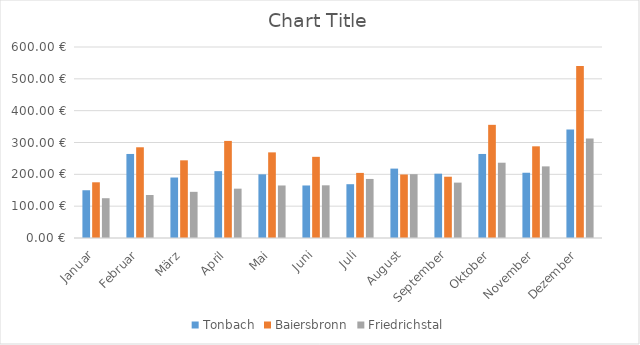
| Category | Tonbach | Baiersbronn | Friedrichstal |
|---|---|---|---|
| Januar | 150 | 175 | 125 |
| Februar | 264 | 285 | 135 |
| März | 190 | 244 | 145 |
| April | 210 | 305 | 155 |
| Mai | 200 | 269 | 165 |
| Juni | 165 | 255 | 165.5 |
| Juli | 169 | 204.5 | 185.5 |
| August | 218 | 199.5 | 200.5 |
| September | 202 | 192.5 | 174 |
| Oktober | 264 | 355.5 | 236.5 |
| November | 205 | 288 | 225 |
| Dezember | 341 | 540 | 312.5 |